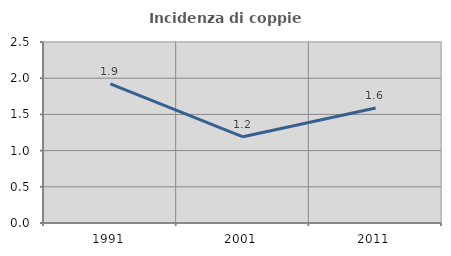
| Category | Incidenza di coppie miste |
|---|---|
| 1991.0 | 1.923 |
| 2001.0 | 1.19 |
| 2011.0 | 1.587 |